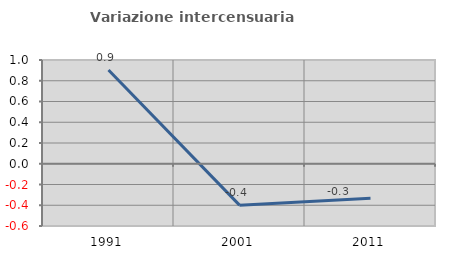
| Category | Variazione intercensuaria annua |
|---|---|
| 1991.0 | 0.904 |
| 2001.0 | -0.399 |
| 2011.0 | -0.333 |